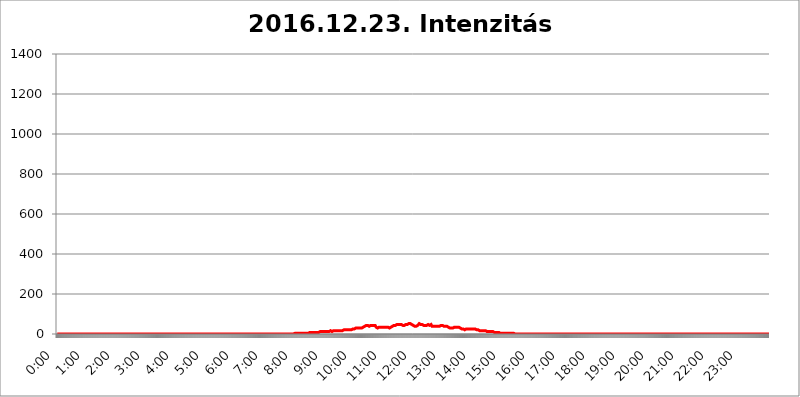
| Category | 2016.12.23. Intenzitás [W/m^2] |
|---|---|
| 0.0 | 0 |
| 0.0006944444444444445 | 0 |
| 0.001388888888888889 | 0 |
| 0.0020833333333333333 | 0 |
| 0.002777777777777778 | 0 |
| 0.003472222222222222 | 0 |
| 0.004166666666666667 | 0 |
| 0.004861111111111111 | 0 |
| 0.005555555555555556 | 0 |
| 0.0062499999999999995 | 0 |
| 0.006944444444444444 | 0 |
| 0.007638888888888889 | 0 |
| 0.008333333333333333 | 0 |
| 0.009027777777777779 | 0 |
| 0.009722222222222222 | 0 |
| 0.010416666666666666 | 0 |
| 0.011111111111111112 | 0 |
| 0.011805555555555555 | 0 |
| 0.012499999999999999 | 0 |
| 0.013194444444444444 | 0 |
| 0.013888888888888888 | 0 |
| 0.014583333333333332 | 0 |
| 0.015277777777777777 | 0 |
| 0.015972222222222224 | 0 |
| 0.016666666666666666 | 0 |
| 0.017361111111111112 | 0 |
| 0.018055555555555557 | 0 |
| 0.01875 | 0 |
| 0.019444444444444445 | 0 |
| 0.02013888888888889 | 0 |
| 0.020833333333333332 | 0 |
| 0.02152777777777778 | 0 |
| 0.022222222222222223 | 0 |
| 0.02291666666666667 | 0 |
| 0.02361111111111111 | 0 |
| 0.024305555555555556 | 0 |
| 0.024999999999999998 | 0 |
| 0.025694444444444447 | 0 |
| 0.02638888888888889 | 0 |
| 0.027083333333333334 | 0 |
| 0.027777777777777776 | 0 |
| 0.02847222222222222 | 0 |
| 0.029166666666666664 | 0 |
| 0.029861111111111113 | 0 |
| 0.030555555555555555 | 0 |
| 0.03125 | 0 |
| 0.03194444444444445 | 0 |
| 0.03263888888888889 | 0 |
| 0.03333333333333333 | 0 |
| 0.034027777777777775 | 0 |
| 0.034722222222222224 | 0 |
| 0.035416666666666666 | 0 |
| 0.036111111111111115 | 0 |
| 0.03680555555555556 | 0 |
| 0.0375 | 0 |
| 0.03819444444444444 | 0 |
| 0.03888888888888889 | 0 |
| 0.03958333333333333 | 0 |
| 0.04027777777777778 | 0 |
| 0.04097222222222222 | 0 |
| 0.041666666666666664 | 0 |
| 0.042361111111111106 | 0 |
| 0.04305555555555556 | 0 |
| 0.043750000000000004 | 0 |
| 0.044444444444444446 | 0 |
| 0.04513888888888889 | 0 |
| 0.04583333333333334 | 0 |
| 0.04652777777777778 | 0 |
| 0.04722222222222222 | 0 |
| 0.04791666666666666 | 0 |
| 0.04861111111111111 | 0 |
| 0.049305555555555554 | 0 |
| 0.049999999999999996 | 0 |
| 0.05069444444444445 | 0 |
| 0.051388888888888894 | 0 |
| 0.052083333333333336 | 0 |
| 0.05277777777777778 | 0 |
| 0.05347222222222222 | 0 |
| 0.05416666666666667 | 0 |
| 0.05486111111111111 | 0 |
| 0.05555555555555555 | 0 |
| 0.05625 | 0 |
| 0.05694444444444444 | 0 |
| 0.057638888888888885 | 0 |
| 0.05833333333333333 | 0 |
| 0.05902777777777778 | 0 |
| 0.059722222222222225 | 0 |
| 0.06041666666666667 | 0 |
| 0.061111111111111116 | 0 |
| 0.06180555555555556 | 0 |
| 0.0625 | 0 |
| 0.06319444444444444 | 0 |
| 0.06388888888888888 | 0 |
| 0.06458333333333334 | 0 |
| 0.06527777777777778 | 0 |
| 0.06597222222222222 | 0 |
| 0.06666666666666667 | 0 |
| 0.06736111111111111 | 0 |
| 0.06805555555555555 | 0 |
| 0.06874999999999999 | 0 |
| 0.06944444444444443 | 0 |
| 0.07013888888888889 | 0 |
| 0.07083333333333333 | 0 |
| 0.07152777777777779 | 0 |
| 0.07222222222222223 | 0 |
| 0.07291666666666667 | 0 |
| 0.07361111111111111 | 0 |
| 0.07430555555555556 | 0 |
| 0.075 | 0 |
| 0.07569444444444444 | 0 |
| 0.0763888888888889 | 0 |
| 0.07708333333333334 | 0 |
| 0.07777777777777778 | 0 |
| 0.07847222222222222 | 0 |
| 0.07916666666666666 | 0 |
| 0.0798611111111111 | 0 |
| 0.08055555555555556 | 0 |
| 0.08125 | 0 |
| 0.08194444444444444 | 0 |
| 0.08263888888888889 | 0 |
| 0.08333333333333333 | 0 |
| 0.08402777777777777 | 0 |
| 0.08472222222222221 | 0 |
| 0.08541666666666665 | 0 |
| 0.08611111111111112 | 0 |
| 0.08680555555555557 | 0 |
| 0.08750000000000001 | 0 |
| 0.08819444444444445 | 0 |
| 0.08888888888888889 | 0 |
| 0.08958333333333333 | 0 |
| 0.09027777777777778 | 0 |
| 0.09097222222222222 | 0 |
| 0.09166666666666667 | 0 |
| 0.09236111111111112 | 0 |
| 0.09305555555555556 | 0 |
| 0.09375 | 0 |
| 0.09444444444444444 | 0 |
| 0.09513888888888888 | 0 |
| 0.09583333333333333 | 0 |
| 0.09652777777777777 | 0 |
| 0.09722222222222222 | 0 |
| 0.09791666666666667 | 0 |
| 0.09861111111111111 | 0 |
| 0.09930555555555555 | 0 |
| 0.09999999999999999 | 0 |
| 0.10069444444444443 | 0 |
| 0.1013888888888889 | 0 |
| 0.10208333333333335 | 0 |
| 0.10277777777777779 | 0 |
| 0.10347222222222223 | 0 |
| 0.10416666666666667 | 0 |
| 0.10486111111111111 | 0 |
| 0.10555555555555556 | 0 |
| 0.10625 | 0 |
| 0.10694444444444444 | 0 |
| 0.1076388888888889 | 0 |
| 0.10833333333333334 | 0 |
| 0.10902777777777778 | 0 |
| 0.10972222222222222 | 0 |
| 0.1111111111111111 | 0 |
| 0.11180555555555556 | 0 |
| 0.11180555555555556 | 0 |
| 0.1125 | 0 |
| 0.11319444444444444 | 0 |
| 0.11388888888888889 | 0 |
| 0.11458333333333333 | 0 |
| 0.11527777777777777 | 0 |
| 0.11597222222222221 | 0 |
| 0.11666666666666665 | 0 |
| 0.1173611111111111 | 0 |
| 0.11805555555555557 | 0 |
| 0.11944444444444445 | 0 |
| 0.12013888888888889 | 0 |
| 0.12083333333333333 | 0 |
| 0.12152777777777778 | 0 |
| 0.12222222222222223 | 0 |
| 0.12291666666666667 | 0 |
| 0.12291666666666667 | 0 |
| 0.12361111111111112 | 0 |
| 0.12430555555555556 | 0 |
| 0.125 | 0 |
| 0.12569444444444444 | 0 |
| 0.12638888888888888 | 0 |
| 0.12708333333333333 | 0 |
| 0.16875 | 0 |
| 0.12847222222222224 | 0 |
| 0.12916666666666668 | 0 |
| 0.12986111111111112 | 0 |
| 0.13055555555555556 | 0 |
| 0.13125 | 0 |
| 0.13194444444444445 | 0 |
| 0.1326388888888889 | 0 |
| 0.13333333333333333 | 0 |
| 0.13402777777777777 | 0 |
| 0.13402777777777777 | 0 |
| 0.13472222222222222 | 0 |
| 0.13541666666666666 | 0 |
| 0.1361111111111111 | 0 |
| 0.13749999999999998 | 0 |
| 0.13819444444444443 | 0 |
| 0.1388888888888889 | 0 |
| 0.13958333333333334 | 0 |
| 0.14027777777777778 | 0 |
| 0.14097222222222222 | 0 |
| 0.14166666666666666 | 0 |
| 0.1423611111111111 | 0 |
| 0.14305555555555557 | 0 |
| 0.14375000000000002 | 0 |
| 0.14444444444444446 | 0 |
| 0.1451388888888889 | 0 |
| 0.1451388888888889 | 0 |
| 0.14652777777777778 | 0 |
| 0.14722222222222223 | 0 |
| 0.14791666666666667 | 0 |
| 0.1486111111111111 | 0 |
| 0.14930555555555555 | 0 |
| 0.15 | 0 |
| 0.15069444444444444 | 0 |
| 0.15138888888888888 | 0 |
| 0.15208333333333332 | 0 |
| 0.15277777777777776 | 0 |
| 0.15347222222222223 | 0 |
| 0.15416666666666667 | 0 |
| 0.15486111111111112 | 0 |
| 0.15555555555555556 | 0 |
| 0.15625 | 0 |
| 0.15694444444444444 | 0 |
| 0.15763888888888888 | 0 |
| 0.15833333333333333 | 0 |
| 0.15902777777777777 | 0 |
| 0.15972222222222224 | 0 |
| 0.16041666666666668 | 0 |
| 0.16111111111111112 | 0 |
| 0.16180555555555556 | 0 |
| 0.1625 | 0 |
| 0.16319444444444445 | 0 |
| 0.1638888888888889 | 0 |
| 0.16458333333333333 | 0 |
| 0.16527777777777777 | 0 |
| 0.16597222222222222 | 0 |
| 0.16666666666666666 | 0 |
| 0.1673611111111111 | 0 |
| 0.16805555555555554 | 0 |
| 0.16874999999999998 | 0 |
| 0.16944444444444443 | 0 |
| 0.17013888888888887 | 0 |
| 0.1708333333333333 | 0 |
| 0.17152777777777775 | 0 |
| 0.17222222222222225 | 0 |
| 0.1729166666666667 | 0 |
| 0.17361111111111113 | 0 |
| 0.17430555555555557 | 0 |
| 0.17500000000000002 | 0 |
| 0.17569444444444446 | 0 |
| 0.1763888888888889 | 0 |
| 0.17708333333333334 | 0 |
| 0.17777777777777778 | 0 |
| 0.17847222222222223 | 0 |
| 0.17916666666666667 | 0 |
| 0.1798611111111111 | 0 |
| 0.18055555555555555 | 0 |
| 0.18125 | 0 |
| 0.18194444444444444 | 0 |
| 0.1826388888888889 | 0 |
| 0.18333333333333335 | 0 |
| 0.1840277777777778 | 0 |
| 0.18472222222222223 | 0 |
| 0.18541666666666667 | 0 |
| 0.18611111111111112 | 0 |
| 0.18680555555555556 | 0 |
| 0.1875 | 0 |
| 0.18819444444444444 | 0 |
| 0.18888888888888888 | 0 |
| 0.18958333333333333 | 0 |
| 0.19027777777777777 | 0 |
| 0.1909722222222222 | 0 |
| 0.19166666666666665 | 0 |
| 0.19236111111111112 | 0 |
| 0.19305555555555554 | 0 |
| 0.19375 | 0 |
| 0.19444444444444445 | 0 |
| 0.1951388888888889 | 0 |
| 0.19583333333333333 | 0 |
| 0.19652777777777777 | 0 |
| 0.19722222222222222 | 0 |
| 0.19791666666666666 | 0 |
| 0.1986111111111111 | 0 |
| 0.19930555555555554 | 0 |
| 0.19999999999999998 | 0 |
| 0.20069444444444443 | 0 |
| 0.20138888888888887 | 0 |
| 0.2020833333333333 | 0 |
| 0.2027777777777778 | 0 |
| 0.2034722222222222 | 0 |
| 0.2041666666666667 | 0 |
| 0.20486111111111113 | 0 |
| 0.20555555555555557 | 0 |
| 0.20625000000000002 | 0 |
| 0.20694444444444446 | 0 |
| 0.2076388888888889 | 0 |
| 0.20833333333333334 | 0 |
| 0.20902777777777778 | 0 |
| 0.20972222222222223 | 0 |
| 0.21041666666666667 | 0 |
| 0.2111111111111111 | 0 |
| 0.21180555555555555 | 0 |
| 0.2125 | 0 |
| 0.21319444444444444 | 0 |
| 0.2138888888888889 | 0 |
| 0.21458333333333335 | 0 |
| 0.2152777777777778 | 0 |
| 0.21597222222222223 | 0 |
| 0.21666666666666667 | 0 |
| 0.21736111111111112 | 0 |
| 0.21805555555555556 | 0 |
| 0.21875 | 0 |
| 0.21944444444444444 | 0 |
| 0.22013888888888888 | 0 |
| 0.22083333333333333 | 0 |
| 0.22152777777777777 | 0 |
| 0.2222222222222222 | 0 |
| 0.22291666666666665 | 0 |
| 0.2236111111111111 | 0 |
| 0.22430555555555556 | 0 |
| 0.225 | 0 |
| 0.22569444444444445 | 0 |
| 0.2263888888888889 | 0 |
| 0.22708333333333333 | 0 |
| 0.22777777777777777 | 0 |
| 0.22847222222222222 | 0 |
| 0.22916666666666666 | 0 |
| 0.2298611111111111 | 0 |
| 0.23055555555555554 | 0 |
| 0.23124999999999998 | 0 |
| 0.23194444444444443 | 0 |
| 0.23263888888888887 | 0 |
| 0.2333333333333333 | 0 |
| 0.2340277777777778 | 0 |
| 0.2347222222222222 | 0 |
| 0.2354166666666667 | 0 |
| 0.23611111111111113 | 0 |
| 0.23680555555555557 | 0 |
| 0.23750000000000002 | 0 |
| 0.23819444444444446 | 0 |
| 0.2388888888888889 | 0 |
| 0.23958333333333334 | 0 |
| 0.24027777777777778 | 0 |
| 0.24097222222222223 | 0 |
| 0.24166666666666667 | 0 |
| 0.2423611111111111 | 0 |
| 0.24305555555555555 | 0 |
| 0.24375 | 0 |
| 0.24444444444444446 | 0 |
| 0.24513888888888888 | 0 |
| 0.24583333333333335 | 0 |
| 0.2465277777777778 | 0 |
| 0.24722222222222223 | 0 |
| 0.24791666666666667 | 0 |
| 0.24861111111111112 | 0 |
| 0.24930555555555556 | 0 |
| 0.25 | 0 |
| 0.25069444444444444 | 0 |
| 0.2513888888888889 | 0 |
| 0.2520833333333333 | 0 |
| 0.25277777777777777 | 0 |
| 0.2534722222222222 | 0 |
| 0.25416666666666665 | 0 |
| 0.2548611111111111 | 0 |
| 0.2555555555555556 | 0 |
| 0.25625000000000003 | 0 |
| 0.2569444444444445 | 0 |
| 0.2576388888888889 | 0 |
| 0.25833333333333336 | 0 |
| 0.2590277777777778 | 0 |
| 0.25972222222222224 | 0 |
| 0.2604166666666667 | 0 |
| 0.2611111111111111 | 0 |
| 0.26180555555555557 | 0 |
| 0.2625 | 0 |
| 0.26319444444444445 | 0 |
| 0.2638888888888889 | 0 |
| 0.26458333333333334 | 0 |
| 0.2652777777777778 | 0 |
| 0.2659722222222222 | 0 |
| 0.26666666666666666 | 0 |
| 0.2673611111111111 | 0 |
| 0.26805555555555555 | 0 |
| 0.26875 | 0 |
| 0.26944444444444443 | 0 |
| 0.2701388888888889 | 0 |
| 0.2708333333333333 | 0 |
| 0.27152777777777776 | 0 |
| 0.2722222222222222 | 0 |
| 0.27291666666666664 | 0 |
| 0.2736111111111111 | 0 |
| 0.2743055555555555 | 0 |
| 0.27499999999999997 | 0 |
| 0.27569444444444446 | 0 |
| 0.27638888888888885 | 0 |
| 0.27708333333333335 | 0 |
| 0.2777777777777778 | 0 |
| 0.27847222222222223 | 0 |
| 0.2791666666666667 | 0 |
| 0.2798611111111111 | 0 |
| 0.28055555555555556 | 0 |
| 0.28125 | 0 |
| 0.28194444444444444 | 0 |
| 0.2826388888888889 | 0 |
| 0.2833333333333333 | 0 |
| 0.28402777777777777 | 0 |
| 0.2847222222222222 | 0 |
| 0.28541666666666665 | 0 |
| 0.28611111111111115 | 0 |
| 0.28680555555555554 | 0 |
| 0.28750000000000003 | 0 |
| 0.2881944444444445 | 0 |
| 0.2888888888888889 | 0 |
| 0.28958333333333336 | 0 |
| 0.2902777777777778 | 0 |
| 0.29097222222222224 | 0 |
| 0.2916666666666667 | 0 |
| 0.2923611111111111 | 0 |
| 0.29305555555555557 | 0 |
| 0.29375 | 0 |
| 0.29444444444444445 | 0 |
| 0.2951388888888889 | 0 |
| 0.29583333333333334 | 0 |
| 0.2965277777777778 | 0 |
| 0.2972222222222222 | 0 |
| 0.29791666666666666 | 0 |
| 0.2986111111111111 | 0 |
| 0.29930555555555555 | 0 |
| 0.3 | 0 |
| 0.30069444444444443 | 0 |
| 0.3013888888888889 | 0 |
| 0.3020833333333333 | 0 |
| 0.30277777777777776 | 0 |
| 0.3034722222222222 | 0 |
| 0.30416666666666664 | 0 |
| 0.3048611111111111 | 0 |
| 0.3055555555555555 | 0 |
| 0.30624999999999997 | 0 |
| 0.3069444444444444 | 0 |
| 0.3076388888888889 | 0 |
| 0.30833333333333335 | 0 |
| 0.3090277777777778 | 0 |
| 0.30972222222222223 | 0 |
| 0.3104166666666667 | 0 |
| 0.3111111111111111 | 0 |
| 0.31180555555555556 | 0 |
| 0.3125 | 0 |
| 0.31319444444444444 | 0 |
| 0.3138888888888889 | 0 |
| 0.3145833333333333 | 0 |
| 0.31527777777777777 | 0 |
| 0.3159722222222222 | 0 |
| 0.31666666666666665 | 0 |
| 0.31736111111111115 | 0 |
| 0.31805555555555554 | 0 |
| 0.31875000000000003 | 0 |
| 0.3194444444444445 | 0 |
| 0.3201388888888889 | 0 |
| 0.32083333333333336 | 0 |
| 0.3215277777777778 | 0 |
| 0.32222222222222224 | 0 |
| 0.3229166666666667 | 0 |
| 0.3236111111111111 | 0 |
| 0.32430555555555557 | 0 |
| 0.325 | 0 |
| 0.32569444444444445 | 0 |
| 0.3263888888888889 | 0 |
| 0.32708333333333334 | 0 |
| 0.3277777777777778 | 0 |
| 0.3284722222222222 | 0 |
| 0.32916666666666666 | 0 |
| 0.3298611111111111 | 0 |
| 0.33055555555555555 | 0 |
| 0.33125 | 0 |
| 0.33194444444444443 | 0 |
| 0.3326388888888889 | 3.525 |
| 0.3333333333333333 | 3.525 |
| 0.3340277777777778 | 3.525 |
| 0.3347222222222222 | 3.525 |
| 0.3354166666666667 | 3.525 |
| 0.3361111111111111 | 3.525 |
| 0.3368055555555556 | 3.525 |
| 0.33749999999999997 | 3.525 |
| 0.33819444444444446 | 3.525 |
| 0.33888888888888885 | 3.525 |
| 0.33958333333333335 | 3.525 |
| 0.34027777777777773 | 3.525 |
| 0.34097222222222223 | 3.525 |
| 0.3416666666666666 | 3.525 |
| 0.3423611111111111 | 3.525 |
| 0.3430555555555555 | 3.525 |
| 0.34375 | 3.525 |
| 0.3444444444444445 | 3.525 |
| 0.3451388888888889 | 3.525 |
| 0.3458333333333334 | 3.525 |
| 0.34652777777777777 | 3.525 |
| 0.34722222222222227 | 3.525 |
| 0.34791666666666665 | 3.525 |
| 0.34861111111111115 | 3.525 |
| 0.34930555555555554 | 3.525 |
| 0.35000000000000003 | 3.525 |
| 0.3506944444444444 | 3.525 |
| 0.3513888888888889 | 3.525 |
| 0.3520833333333333 | 3.525 |
| 0.3527777777777778 | 7.887 |
| 0.3534722222222222 | 7.887 |
| 0.3541666666666667 | 7.887 |
| 0.3548611111111111 | 7.887 |
| 0.35555555555555557 | 7.887 |
| 0.35625 | 7.887 |
| 0.35694444444444445 | 7.887 |
| 0.3576388888888889 | 7.887 |
| 0.35833333333333334 | 7.887 |
| 0.3590277777777778 | 7.887 |
| 0.3597222222222222 | 7.887 |
| 0.36041666666666666 | 7.887 |
| 0.3611111111111111 | 7.887 |
| 0.36180555555555555 | 7.887 |
| 0.3625 | 7.887 |
| 0.36319444444444443 | 7.887 |
| 0.3638888888888889 | 7.887 |
| 0.3645833333333333 | 7.887 |
| 0.3652777777777778 | 7.887 |
| 0.3659722222222222 | 7.887 |
| 0.3666666666666667 | 7.887 |
| 0.3673611111111111 | 12.257 |
| 0.3680555555555556 | 12.257 |
| 0.36874999999999997 | 12.257 |
| 0.36944444444444446 | 12.257 |
| 0.37013888888888885 | 12.257 |
| 0.37083333333333335 | 12.257 |
| 0.37152777777777773 | 12.257 |
| 0.37222222222222223 | 12.257 |
| 0.3729166666666666 | 12.257 |
| 0.3736111111111111 | 12.257 |
| 0.3743055555555555 | 12.257 |
| 0.375 | 12.257 |
| 0.3756944444444445 | 12.257 |
| 0.3763888888888889 | 12.257 |
| 0.3770833333333334 | 12.257 |
| 0.37777777777777777 | 12.257 |
| 0.37847222222222227 | 12.257 |
| 0.37916666666666665 | 12.257 |
| 0.37986111111111115 | 12.257 |
| 0.38055555555555554 | 12.257 |
| 0.38125000000000003 | 12.257 |
| 0.3819444444444444 | 12.257 |
| 0.3826388888888889 | 12.257 |
| 0.3833333333333333 | 16.636 |
| 0.3840277777777778 | 16.636 |
| 0.3847222222222222 | 16.636 |
| 0.3854166666666667 | 12.257 |
| 0.3861111111111111 | 16.636 |
| 0.38680555555555557 | 16.636 |
| 0.3875 | 16.636 |
| 0.38819444444444445 | 16.636 |
| 0.3888888888888889 | 16.636 |
| 0.38958333333333334 | 16.636 |
| 0.3902777777777778 | 16.636 |
| 0.3909722222222222 | 16.636 |
| 0.39166666666666666 | 16.636 |
| 0.3923611111111111 | 16.636 |
| 0.39305555555555555 | 16.636 |
| 0.39375 | 16.636 |
| 0.39444444444444443 | 16.636 |
| 0.3951388888888889 | 16.636 |
| 0.3958333333333333 | 16.636 |
| 0.3965277777777778 | 16.636 |
| 0.3972222222222222 | 16.636 |
| 0.3979166666666667 | 16.636 |
| 0.3986111111111111 | 16.636 |
| 0.3993055555555556 | 16.636 |
| 0.39999999999999997 | 16.636 |
| 0.40069444444444446 | 21.024 |
| 0.40138888888888885 | 21.024 |
| 0.40208333333333335 | 21.024 |
| 0.40277777777777773 | 21.024 |
| 0.40347222222222223 | 21.024 |
| 0.4041666666666666 | 21.024 |
| 0.4048611111111111 | 21.024 |
| 0.4055555555555555 | 21.024 |
| 0.40625 | 21.024 |
| 0.4069444444444445 | 21.024 |
| 0.4076388888888889 | 21.024 |
| 0.4083333333333334 | 21.024 |
| 0.40902777777777777 | 21.024 |
| 0.40972222222222227 | 21.024 |
| 0.41041666666666665 | 21.024 |
| 0.41111111111111115 | 21.024 |
| 0.41180555555555554 | 21.024 |
| 0.41250000000000003 | 21.024 |
| 0.4131944444444444 | 21.024 |
| 0.4138888888888889 | 21.024 |
| 0.4145833333333333 | 25.419 |
| 0.4152777777777778 | 25.419 |
| 0.4159722222222222 | 25.419 |
| 0.4166666666666667 | 25.419 |
| 0.4173611111111111 | 29.823 |
| 0.41805555555555557 | 29.823 |
| 0.41875 | 29.823 |
| 0.41944444444444445 | 29.823 |
| 0.4201388888888889 | 29.823 |
| 0.42083333333333334 | 29.823 |
| 0.4215277777777778 | 29.823 |
| 0.4222222222222222 | 29.823 |
| 0.42291666666666666 | 29.823 |
| 0.4236111111111111 | 29.823 |
| 0.42430555555555555 | 29.823 |
| 0.425 | 29.823 |
| 0.42569444444444443 | 29.823 |
| 0.4263888888888889 | 29.823 |
| 0.4270833333333333 | 29.823 |
| 0.4277777777777778 | 29.823 |
| 0.4284722222222222 | 29.823 |
| 0.4291666666666667 | 34.234 |
| 0.4298611111111111 | 34.234 |
| 0.4305555555555556 | 38.653 |
| 0.43124999999999997 | 38.653 |
| 0.43194444444444446 | 43.079 |
| 0.43263888888888885 | 43.079 |
| 0.43333333333333335 | 43.079 |
| 0.43402777777777773 | 43.079 |
| 0.43472222222222223 | 43.079 |
| 0.4354166666666666 | 43.079 |
| 0.4361111111111111 | 43.079 |
| 0.4368055555555555 | 38.653 |
| 0.4375 | 38.653 |
| 0.4381944444444445 | 38.653 |
| 0.4388888888888889 | 38.653 |
| 0.4395833333333334 | 43.079 |
| 0.44027777777777777 | 38.653 |
| 0.44097222222222227 | 38.653 |
| 0.44166666666666665 | 43.079 |
| 0.44236111111111115 | 43.079 |
| 0.44305555555555554 | 43.079 |
| 0.44375000000000003 | 43.079 |
| 0.4444444444444444 | 43.079 |
| 0.4451388888888889 | 43.079 |
| 0.4458333333333333 | 43.079 |
| 0.4465277777777778 | 38.653 |
| 0.4472222222222222 | 34.234 |
| 0.4479166666666667 | 34.234 |
| 0.4486111111111111 | 34.234 |
| 0.44930555555555557 | 29.823 |
| 0.45 | 34.234 |
| 0.45069444444444445 | 34.234 |
| 0.4513888888888889 | 34.234 |
| 0.45208333333333334 | 34.234 |
| 0.4527777777777778 | 34.234 |
| 0.4534722222222222 | 34.234 |
| 0.45416666666666666 | 34.234 |
| 0.4548611111111111 | 34.234 |
| 0.45555555555555555 | 34.234 |
| 0.45625 | 34.234 |
| 0.45694444444444443 | 34.234 |
| 0.4576388888888889 | 34.234 |
| 0.4583333333333333 | 34.234 |
| 0.4590277777777778 | 34.234 |
| 0.4597222222222222 | 34.234 |
| 0.4604166666666667 | 34.234 |
| 0.4611111111111111 | 34.234 |
| 0.4618055555555556 | 34.234 |
| 0.46249999999999997 | 34.234 |
| 0.46319444444444446 | 34.234 |
| 0.46388888888888885 | 34.234 |
| 0.46458333333333335 | 34.234 |
| 0.46527777777777773 | 29.823 |
| 0.46597222222222223 | 29.823 |
| 0.4666666666666666 | 29.823 |
| 0.4673611111111111 | 34.234 |
| 0.4680555555555555 | 34.234 |
| 0.46875 | 34.234 |
| 0.4694444444444445 | 38.653 |
| 0.4701388888888889 | 38.653 |
| 0.4708333333333334 | 38.653 |
| 0.47152777777777777 | 43.079 |
| 0.47222222222222227 | 43.079 |
| 0.47291666666666665 | 43.079 |
| 0.47361111111111115 | 47.511 |
| 0.47430555555555554 | 43.079 |
| 0.47500000000000003 | 43.079 |
| 0.4756944444444444 | 47.511 |
| 0.4763888888888889 | 47.511 |
| 0.4770833333333333 | 47.511 |
| 0.4777777777777778 | 47.511 |
| 0.4784722222222222 | 47.511 |
| 0.4791666666666667 | 47.511 |
| 0.4798611111111111 | 47.511 |
| 0.48055555555555557 | 47.511 |
| 0.48125 | 47.511 |
| 0.48194444444444445 | 47.511 |
| 0.4826388888888889 | 47.511 |
| 0.48333333333333334 | 47.511 |
| 0.4840277777777778 | 47.511 |
| 0.4847222222222222 | 43.079 |
| 0.48541666666666666 | 43.079 |
| 0.4861111111111111 | 43.079 |
| 0.48680555555555555 | 43.079 |
| 0.4875 | 43.079 |
| 0.48819444444444443 | 43.079 |
| 0.4888888888888889 | 47.511 |
| 0.4895833333333333 | 47.511 |
| 0.4902777777777778 | 43.079 |
| 0.4909722222222222 | 47.511 |
| 0.4916666666666667 | 47.511 |
| 0.4923611111111111 | 47.511 |
| 0.4930555555555556 | 51.951 |
| 0.49374999999999997 | 51.951 |
| 0.49444444444444446 | 56.398 |
| 0.49513888888888885 | 51.951 |
| 0.49583333333333335 | 51.951 |
| 0.49652777777777773 | 47.511 |
| 0.49722222222222223 | 47.511 |
| 0.4979166666666666 | 47.511 |
| 0.4986111111111111 | 43.079 |
| 0.4993055555555555 | 43.079 |
| 0.5 | 43.079 |
| 0.5006944444444444 | 38.653 |
| 0.5013888888888889 | 38.653 |
| 0.5020833333333333 | 38.653 |
| 0.5027777777777778 | 38.653 |
| 0.5034722222222222 | 38.653 |
| 0.5041666666666667 | 43.079 |
| 0.5048611111111111 | 43.079 |
| 0.5055555555555555 | 43.079 |
| 0.50625 | 47.511 |
| 0.5069444444444444 | 47.511 |
| 0.5076388888888889 | 51.951 |
| 0.5083333333333333 | 51.951 |
| 0.5090277777777777 | 47.511 |
| 0.5097222222222222 | 47.511 |
| 0.5104166666666666 | 47.511 |
| 0.5111111111111112 | 47.511 |
| 0.5118055555555555 | 47.511 |
| 0.5125000000000001 | 43.079 |
| 0.5131944444444444 | 43.079 |
| 0.513888888888889 | 43.079 |
| 0.5145833333333333 | 47.511 |
| 0.5152777777777778 | 47.511 |
| 0.5159722222222222 | 43.079 |
| 0.5166666666666667 | 43.079 |
| 0.517361111111111 | 43.079 |
| 0.5180555555555556 | 43.079 |
| 0.5187499999999999 | 47.511 |
| 0.5194444444444445 | 47.511 |
| 0.5201388888888888 | 47.511 |
| 0.5208333333333334 | 47.511 |
| 0.5215277777777778 | 43.079 |
| 0.5222222222222223 | 43.079 |
| 0.5229166666666667 | 43.079 |
| 0.5236111111111111 | 47.511 |
| 0.5243055555555556 | 47.511 |
| 0.525 | 43.079 |
| 0.5256944444444445 | 38.653 |
| 0.5263888888888889 | 38.653 |
| 0.5270833333333333 | 38.653 |
| 0.5277777777777778 | 38.653 |
| 0.5284722222222222 | 43.079 |
| 0.5291666666666667 | 43.079 |
| 0.5298611111111111 | 38.653 |
| 0.5305555555555556 | 38.653 |
| 0.53125 | 38.653 |
| 0.5319444444444444 | 38.653 |
| 0.5326388888888889 | 38.653 |
| 0.5333333333333333 | 38.653 |
| 0.5340277777777778 | 38.653 |
| 0.5347222222222222 | 38.653 |
| 0.5354166666666667 | 38.653 |
| 0.5361111111111111 | 38.653 |
| 0.5368055555555555 | 38.653 |
| 0.5375 | 38.653 |
| 0.5381944444444444 | 43.079 |
| 0.5388888888888889 | 43.079 |
| 0.5395833333333333 | 43.079 |
| 0.5402777777777777 | 43.079 |
| 0.5409722222222222 | 43.079 |
| 0.5416666666666666 | 38.653 |
| 0.5423611111111112 | 38.653 |
| 0.5430555555555555 | 38.653 |
| 0.5437500000000001 | 38.653 |
| 0.5444444444444444 | 38.653 |
| 0.545138888888889 | 43.079 |
| 0.5458333333333333 | 38.653 |
| 0.5465277777777778 | 38.653 |
| 0.5472222222222222 | 38.653 |
| 0.5479166666666667 | 34.234 |
| 0.548611111111111 | 34.234 |
| 0.5493055555555556 | 29.823 |
| 0.5499999999999999 | 29.823 |
| 0.5506944444444445 | 29.823 |
| 0.5513888888888888 | 29.823 |
| 0.5520833333333334 | 29.823 |
| 0.5527777777777778 | 29.823 |
| 0.5534722222222223 | 29.823 |
| 0.5541666666666667 | 29.823 |
| 0.5548611111111111 | 29.823 |
| 0.5555555555555556 | 29.823 |
| 0.55625 | 29.823 |
| 0.5569444444444445 | 34.234 |
| 0.5576388888888889 | 34.234 |
| 0.5583333333333333 | 34.234 |
| 0.5590277777777778 | 34.234 |
| 0.5597222222222222 | 34.234 |
| 0.5604166666666667 | 38.653 |
| 0.5611111111111111 | 34.234 |
| 0.5618055555555556 | 34.234 |
| 0.5625 | 34.234 |
| 0.5631944444444444 | 34.234 |
| 0.5638888888888889 | 29.823 |
| 0.5645833333333333 | 29.823 |
| 0.5652777777777778 | 29.823 |
| 0.5659722222222222 | 29.823 |
| 0.5666666666666667 | 29.823 |
| 0.5673611111111111 | 25.419 |
| 0.5680555555555555 | 29.823 |
| 0.56875 | 25.419 |
| 0.5694444444444444 | 25.419 |
| 0.5701388888888889 | 25.419 |
| 0.5708333333333333 | 21.024 |
| 0.5715277777777777 | 21.024 |
| 0.5722222222222222 | 21.024 |
| 0.5729166666666666 | 21.024 |
| 0.5736111111111112 | 25.419 |
| 0.5743055555555555 | 25.419 |
| 0.5750000000000001 | 25.419 |
| 0.5756944444444444 | 25.419 |
| 0.576388888888889 | 25.419 |
| 0.5770833333333333 | 25.419 |
| 0.5777777777777778 | 25.419 |
| 0.5784722222222222 | 25.419 |
| 0.5791666666666667 | 25.419 |
| 0.579861111111111 | 25.419 |
| 0.5805555555555556 | 29.823 |
| 0.5812499999999999 | 25.419 |
| 0.5819444444444445 | 25.419 |
| 0.5826388888888888 | 29.823 |
| 0.5833333333333334 | 25.419 |
| 0.5840277777777778 | 25.419 |
| 0.5847222222222223 | 25.419 |
| 0.5854166666666667 | 25.419 |
| 0.5861111111111111 | 25.419 |
| 0.5868055555555556 | 25.419 |
| 0.5875 | 25.419 |
| 0.5881944444444445 | 21.024 |
| 0.5888888888888889 | 21.024 |
| 0.5895833333333333 | 21.024 |
| 0.5902777777777778 | 21.024 |
| 0.5909722222222222 | 21.024 |
| 0.5916666666666667 | 16.636 |
| 0.5923611111111111 | 16.636 |
| 0.5930555555555556 | 16.636 |
| 0.59375 | 16.636 |
| 0.5944444444444444 | 16.636 |
| 0.5951388888888889 | 16.636 |
| 0.5958333333333333 | 16.636 |
| 0.5965277777777778 | 16.636 |
| 0.5972222222222222 | 16.636 |
| 0.5979166666666667 | 16.636 |
| 0.5986111111111111 | 16.636 |
| 0.5993055555555555 | 16.636 |
| 0.6 | 16.636 |
| 0.6006944444444444 | 16.636 |
| 0.6013888888888889 | 16.636 |
| 0.6020833333333333 | 16.636 |
| 0.6027777777777777 | 12.257 |
| 0.6034722222222222 | 12.257 |
| 0.6041666666666666 | 12.257 |
| 0.6048611111111112 | 12.257 |
| 0.6055555555555555 | 12.257 |
| 0.6062500000000001 | 12.257 |
| 0.6069444444444444 | 12.257 |
| 0.607638888888889 | 12.257 |
| 0.6083333333333333 | 12.257 |
| 0.6090277777777778 | 12.257 |
| 0.6097222222222222 | 12.257 |
| 0.6104166666666667 | 12.257 |
| 0.611111111111111 | 12.257 |
| 0.6118055555555556 | 12.257 |
| 0.6124999999999999 | 7.887 |
| 0.6131944444444445 | 7.887 |
| 0.6138888888888888 | 7.887 |
| 0.6145833333333334 | 7.887 |
| 0.6152777777777778 | 7.887 |
| 0.6159722222222223 | 7.887 |
| 0.6166666666666667 | 7.887 |
| 0.6173611111111111 | 7.887 |
| 0.6180555555555556 | 7.887 |
| 0.61875 | 7.887 |
| 0.6194444444444445 | 7.887 |
| 0.6201388888888889 | 7.887 |
| 0.6208333333333333 | 7.887 |
| 0.6215277777777778 | 3.525 |
| 0.6222222222222222 | 7.887 |
| 0.6229166666666667 | 3.525 |
| 0.6236111111111111 | 3.525 |
| 0.6243055555555556 | 3.525 |
| 0.625 | 3.525 |
| 0.6256944444444444 | 3.525 |
| 0.6263888888888889 | 3.525 |
| 0.6270833333333333 | 3.525 |
| 0.6277777777777778 | 3.525 |
| 0.6284722222222222 | 3.525 |
| 0.6291666666666667 | 3.525 |
| 0.6298611111111111 | 3.525 |
| 0.6305555555555555 | 3.525 |
| 0.63125 | 3.525 |
| 0.6319444444444444 | 3.525 |
| 0.6326388888888889 | 3.525 |
| 0.6333333333333333 | 3.525 |
| 0.6340277777777777 | 3.525 |
| 0.6347222222222222 | 3.525 |
| 0.6354166666666666 | 3.525 |
| 0.6361111111111112 | 3.525 |
| 0.6368055555555555 | 3.525 |
| 0.6375000000000001 | 3.525 |
| 0.6381944444444444 | 3.525 |
| 0.638888888888889 | 3.525 |
| 0.6395833333333333 | 0 |
| 0.6402777777777778 | 3.525 |
| 0.6409722222222222 | 3.525 |
| 0.6416666666666667 | 0 |
| 0.642361111111111 | 0 |
| 0.6430555555555556 | 0 |
| 0.6437499999999999 | 0 |
| 0.6444444444444445 | 0 |
| 0.6451388888888888 | 0 |
| 0.6458333333333334 | 0 |
| 0.6465277777777778 | 0 |
| 0.6472222222222223 | 0 |
| 0.6479166666666667 | 0 |
| 0.6486111111111111 | 0 |
| 0.6493055555555556 | 0 |
| 0.65 | 0 |
| 0.6506944444444445 | 0 |
| 0.6513888888888889 | 0 |
| 0.6520833333333333 | 0 |
| 0.6527777777777778 | 0 |
| 0.6534722222222222 | 0 |
| 0.6541666666666667 | 0 |
| 0.6548611111111111 | 0 |
| 0.6555555555555556 | 0 |
| 0.65625 | 0 |
| 0.6569444444444444 | 0 |
| 0.6576388888888889 | 0 |
| 0.6583333333333333 | 0 |
| 0.6590277777777778 | 0 |
| 0.6597222222222222 | 0 |
| 0.6604166666666667 | 0 |
| 0.6611111111111111 | 0 |
| 0.6618055555555555 | 0 |
| 0.6625 | 0 |
| 0.6631944444444444 | 0 |
| 0.6638888888888889 | 0 |
| 0.6645833333333333 | 0 |
| 0.6652777777777777 | 0 |
| 0.6659722222222222 | 0 |
| 0.6666666666666666 | 0 |
| 0.6673611111111111 | 0 |
| 0.6680555555555556 | 0 |
| 0.6687500000000001 | 0 |
| 0.6694444444444444 | 0 |
| 0.6701388888888888 | 0 |
| 0.6708333333333334 | 0 |
| 0.6715277777777778 | 0 |
| 0.6722222222222222 | 0 |
| 0.6729166666666666 | 0 |
| 0.6736111111111112 | 0 |
| 0.6743055555555556 | 0 |
| 0.6749999999999999 | 0 |
| 0.6756944444444444 | 0 |
| 0.6763888888888889 | 0 |
| 0.6770833333333334 | 0 |
| 0.6777777777777777 | 0 |
| 0.6784722222222223 | 0 |
| 0.6791666666666667 | 0 |
| 0.6798611111111111 | 0 |
| 0.6805555555555555 | 0 |
| 0.68125 | 0 |
| 0.6819444444444445 | 0 |
| 0.6826388888888889 | 0 |
| 0.6833333333333332 | 0 |
| 0.6840277777777778 | 0 |
| 0.6847222222222222 | 0 |
| 0.6854166666666667 | 0 |
| 0.686111111111111 | 0 |
| 0.6868055555555556 | 0 |
| 0.6875 | 0 |
| 0.6881944444444444 | 0 |
| 0.688888888888889 | 0 |
| 0.6895833333333333 | 0 |
| 0.6902777777777778 | 0 |
| 0.6909722222222222 | 0 |
| 0.6916666666666668 | 0 |
| 0.6923611111111111 | 0 |
| 0.6930555555555555 | 0 |
| 0.69375 | 0 |
| 0.6944444444444445 | 0 |
| 0.6951388888888889 | 0 |
| 0.6958333333333333 | 0 |
| 0.6965277777777777 | 0 |
| 0.6972222222222223 | 0 |
| 0.6979166666666666 | 0 |
| 0.6986111111111111 | 0 |
| 0.6993055555555556 | 0 |
| 0.7000000000000001 | 0 |
| 0.7006944444444444 | 0 |
| 0.7013888888888888 | 0 |
| 0.7020833333333334 | 0 |
| 0.7027777777777778 | 0 |
| 0.7034722222222222 | 0 |
| 0.7041666666666666 | 0 |
| 0.7048611111111112 | 0 |
| 0.7055555555555556 | 0 |
| 0.7062499999999999 | 0 |
| 0.7069444444444444 | 0 |
| 0.7076388888888889 | 0 |
| 0.7083333333333334 | 0 |
| 0.7090277777777777 | 0 |
| 0.7097222222222223 | 0 |
| 0.7104166666666667 | 0 |
| 0.7111111111111111 | 0 |
| 0.7118055555555555 | 0 |
| 0.7125 | 0 |
| 0.7131944444444445 | 0 |
| 0.7138888888888889 | 0 |
| 0.7145833333333332 | 0 |
| 0.7152777777777778 | 0 |
| 0.7159722222222222 | 0 |
| 0.7166666666666667 | 0 |
| 0.717361111111111 | 0 |
| 0.7180555555555556 | 0 |
| 0.71875 | 0 |
| 0.7194444444444444 | 0 |
| 0.720138888888889 | 0 |
| 0.7208333333333333 | 0 |
| 0.7215277777777778 | 0 |
| 0.7222222222222222 | 0 |
| 0.7229166666666668 | 0 |
| 0.7236111111111111 | 0 |
| 0.7243055555555555 | 0 |
| 0.725 | 0 |
| 0.7256944444444445 | 0 |
| 0.7263888888888889 | 0 |
| 0.7270833333333333 | 0 |
| 0.7277777777777777 | 0 |
| 0.7284722222222223 | 0 |
| 0.7291666666666666 | 0 |
| 0.7298611111111111 | 0 |
| 0.7305555555555556 | 0 |
| 0.7312500000000001 | 0 |
| 0.7319444444444444 | 0 |
| 0.7326388888888888 | 0 |
| 0.7333333333333334 | 0 |
| 0.7340277777777778 | 0 |
| 0.7347222222222222 | 0 |
| 0.7354166666666666 | 0 |
| 0.7361111111111112 | 0 |
| 0.7368055555555556 | 0 |
| 0.7374999999999999 | 0 |
| 0.7381944444444444 | 0 |
| 0.7388888888888889 | 0 |
| 0.7395833333333334 | 0 |
| 0.7402777777777777 | 0 |
| 0.7409722222222223 | 0 |
| 0.7416666666666667 | 0 |
| 0.7423611111111111 | 0 |
| 0.7430555555555555 | 0 |
| 0.74375 | 0 |
| 0.7444444444444445 | 0 |
| 0.7451388888888889 | 0 |
| 0.7458333333333332 | 0 |
| 0.7465277777777778 | 0 |
| 0.7472222222222222 | 0 |
| 0.7479166666666667 | 0 |
| 0.748611111111111 | 0 |
| 0.7493055555555556 | 0 |
| 0.75 | 0 |
| 0.7506944444444444 | 0 |
| 0.751388888888889 | 0 |
| 0.7520833333333333 | 0 |
| 0.7527777777777778 | 0 |
| 0.7534722222222222 | 0 |
| 0.7541666666666668 | 0 |
| 0.7548611111111111 | 0 |
| 0.7555555555555555 | 0 |
| 0.75625 | 0 |
| 0.7569444444444445 | 0 |
| 0.7576388888888889 | 0 |
| 0.7583333333333333 | 0 |
| 0.7590277777777777 | 0 |
| 0.7597222222222223 | 0 |
| 0.7604166666666666 | 0 |
| 0.7611111111111111 | 0 |
| 0.7618055555555556 | 0 |
| 0.7625000000000001 | 0 |
| 0.7631944444444444 | 0 |
| 0.7638888888888888 | 0 |
| 0.7645833333333334 | 0 |
| 0.7652777777777778 | 0 |
| 0.7659722222222222 | 0 |
| 0.7666666666666666 | 0 |
| 0.7673611111111112 | 0 |
| 0.7680555555555556 | 0 |
| 0.7687499999999999 | 0 |
| 0.7694444444444444 | 0 |
| 0.7701388888888889 | 0 |
| 0.7708333333333334 | 0 |
| 0.7715277777777777 | 0 |
| 0.7722222222222223 | 0 |
| 0.7729166666666667 | 0 |
| 0.7736111111111111 | 0 |
| 0.7743055555555555 | 0 |
| 0.775 | 0 |
| 0.7756944444444445 | 0 |
| 0.7763888888888889 | 0 |
| 0.7770833333333332 | 0 |
| 0.7777777777777778 | 0 |
| 0.7784722222222222 | 0 |
| 0.7791666666666667 | 0 |
| 0.779861111111111 | 0 |
| 0.7805555555555556 | 0 |
| 0.78125 | 0 |
| 0.7819444444444444 | 0 |
| 0.782638888888889 | 0 |
| 0.7833333333333333 | 0 |
| 0.7840277777777778 | 0 |
| 0.7847222222222222 | 0 |
| 0.7854166666666668 | 0 |
| 0.7861111111111111 | 0 |
| 0.7868055555555555 | 0 |
| 0.7875 | 0 |
| 0.7881944444444445 | 0 |
| 0.7888888888888889 | 0 |
| 0.7895833333333333 | 0 |
| 0.7902777777777777 | 0 |
| 0.7909722222222223 | 0 |
| 0.7916666666666666 | 0 |
| 0.7923611111111111 | 0 |
| 0.7930555555555556 | 0 |
| 0.7937500000000001 | 0 |
| 0.7944444444444444 | 0 |
| 0.7951388888888888 | 0 |
| 0.7958333333333334 | 0 |
| 0.7965277777777778 | 0 |
| 0.7972222222222222 | 0 |
| 0.7979166666666666 | 0 |
| 0.7986111111111112 | 0 |
| 0.7993055555555556 | 0 |
| 0.7999999999999999 | 0 |
| 0.8006944444444444 | 0 |
| 0.8013888888888889 | 0 |
| 0.8020833333333334 | 0 |
| 0.8027777777777777 | 0 |
| 0.8034722222222223 | 0 |
| 0.8041666666666667 | 0 |
| 0.8048611111111111 | 0 |
| 0.8055555555555555 | 0 |
| 0.80625 | 0 |
| 0.8069444444444445 | 0 |
| 0.8076388888888889 | 0 |
| 0.8083333333333332 | 0 |
| 0.8090277777777778 | 0 |
| 0.8097222222222222 | 0 |
| 0.8104166666666667 | 0 |
| 0.811111111111111 | 0 |
| 0.8118055555555556 | 0 |
| 0.8125 | 0 |
| 0.8131944444444444 | 0 |
| 0.813888888888889 | 0 |
| 0.8145833333333333 | 0 |
| 0.8152777777777778 | 0 |
| 0.8159722222222222 | 0 |
| 0.8166666666666668 | 0 |
| 0.8173611111111111 | 0 |
| 0.8180555555555555 | 0 |
| 0.81875 | 0 |
| 0.8194444444444445 | 0 |
| 0.8201388888888889 | 0 |
| 0.8208333333333333 | 0 |
| 0.8215277777777777 | 0 |
| 0.8222222222222223 | 0 |
| 0.8229166666666666 | 0 |
| 0.8236111111111111 | 0 |
| 0.8243055555555556 | 0 |
| 0.8250000000000001 | 0 |
| 0.8256944444444444 | 0 |
| 0.8263888888888888 | 0 |
| 0.8270833333333334 | 0 |
| 0.8277777777777778 | 0 |
| 0.8284722222222222 | 0 |
| 0.8291666666666666 | 0 |
| 0.8298611111111112 | 0 |
| 0.8305555555555556 | 0 |
| 0.8312499999999999 | 0 |
| 0.8319444444444444 | 0 |
| 0.8326388888888889 | 0 |
| 0.8333333333333334 | 0 |
| 0.8340277777777777 | 0 |
| 0.8347222222222223 | 0 |
| 0.8354166666666667 | 0 |
| 0.8361111111111111 | 0 |
| 0.8368055555555555 | 0 |
| 0.8375 | 0 |
| 0.8381944444444445 | 0 |
| 0.8388888888888889 | 0 |
| 0.8395833333333332 | 0 |
| 0.8402777777777778 | 0 |
| 0.8409722222222222 | 0 |
| 0.8416666666666667 | 0 |
| 0.842361111111111 | 0 |
| 0.8430555555555556 | 0 |
| 0.84375 | 0 |
| 0.8444444444444444 | 0 |
| 0.845138888888889 | 0 |
| 0.8458333333333333 | 0 |
| 0.8465277777777778 | 0 |
| 0.8472222222222222 | 0 |
| 0.8479166666666668 | 0 |
| 0.8486111111111111 | 0 |
| 0.8493055555555555 | 0 |
| 0.85 | 0 |
| 0.8506944444444445 | 0 |
| 0.8513888888888889 | 0 |
| 0.8520833333333333 | 0 |
| 0.8527777777777777 | 0 |
| 0.8534722222222223 | 0 |
| 0.8541666666666666 | 0 |
| 0.8548611111111111 | 0 |
| 0.8555555555555556 | 0 |
| 0.8562500000000001 | 0 |
| 0.8569444444444444 | 0 |
| 0.8576388888888888 | 0 |
| 0.8583333333333334 | 0 |
| 0.8590277777777778 | 0 |
| 0.8597222222222222 | 0 |
| 0.8604166666666666 | 0 |
| 0.8611111111111112 | 0 |
| 0.8618055555555556 | 0 |
| 0.8624999999999999 | 0 |
| 0.8631944444444444 | 0 |
| 0.8638888888888889 | 0 |
| 0.8645833333333334 | 0 |
| 0.8652777777777777 | 0 |
| 0.8659722222222223 | 0 |
| 0.8666666666666667 | 0 |
| 0.8673611111111111 | 0 |
| 0.8680555555555555 | 0 |
| 0.86875 | 0 |
| 0.8694444444444445 | 0 |
| 0.8701388888888889 | 0 |
| 0.8708333333333332 | 0 |
| 0.8715277777777778 | 0 |
| 0.8722222222222222 | 0 |
| 0.8729166666666667 | 0 |
| 0.873611111111111 | 0 |
| 0.8743055555555556 | 0 |
| 0.875 | 0 |
| 0.8756944444444444 | 0 |
| 0.876388888888889 | 0 |
| 0.8770833333333333 | 0 |
| 0.8777777777777778 | 0 |
| 0.8784722222222222 | 0 |
| 0.8791666666666668 | 0 |
| 0.8798611111111111 | 0 |
| 0.8805555555555555 | 0 |
| 0.88125 | 0 |
| 0.8819444444444445 | 0 |
| 0.8826388888888889 | 0 |
| 0.8833333333333333 | 0 |
| 0.8840277777777777 | 0 |
| 0.8847222222222223 | 0 |
| 0.8854166666666666 | 0 |
| 0.8861111111111111 | 0 |
| 0.8868055555555556 | 0 |
| 0.8875000000000001 | 0 |
| 0.8881944444444444 | 0 |
| 0.8888888888888888 | 0 |
| 0.8895833333333334 | 0 |
| 0.8902777777777778 | 0 |
| 0.8909722222222222 | 0 |
| 0.8916666666666666 | 0 |
| 0.8923611111111112 | 0 |
| 0.8930555555555556 | 0 |
| 0.8937499999999999 | 0 |
| 0.8944444444444444 | 0 |
| 0.8951388888888889 | 0 |
| 0.8958333333333334 | 0 |
| 0.8965277777777777 | 0 |
| 0.8972222222222223 | 0 |
| 0.8979166666666667 | 0 |
| 0.8986111111111111 | 0 |
| 0.8993055555555555 | 0 |
| 0.9 | 0 |
| 0.9006944444444445 | 0 |
| 0.9013888888888889 | 0 |
| 0.9020833333333332 | 0 |
| 0.9027777777777778 | 0 |
| 0.9034722222222222 | 0 |
| 0.9041666666666667 | 0 |
| 0.904861111111111 | 0 |
| 0.9055555555555556 | 0 |
| 0.90625 | 0 |
| 0.9069444444444444 | 0 |
| 0.907638888888889 | 0 |
| 0.9083333333333333 | 0 |
| 0.9090277777777778 | 0 |
| 0.9097222222222222 | 0 |
| 0.9104166666666668 | 0 |
| 0.9111111111111111 | 0 |
| 0.9118055555555555 | 0 |
| 0.9125 | 0 |
| 0.9131944444444445 | 0 |
| 0.9138888888888889 | 0 |
| 0.9145833333333333 | 0 |
| 0.9152777777777777 | 0 |
| 0.9159722222222223 | 0 |
| 0.9166666666666666 | 0 |
| 0.9173611111111111 | 0 |
| 0.9180555555555556 | 0 |
| 0.9187500000000001 | 0 |
| 0.9194444444444444 | 0 |
| 0.9201388888888888 | 0 |
| 0.9208333333333334 | 0 |
| 0.9215277777777778 | 0 |
| 0.9222222222222222 | 0 |
| 0.9229166666666666 | 0 |
| 0.9236111111111112 | 0 |
| 0.9243055555555556 | 0 |
| 0.9249999999999999 | 0 |
| 0.9256944444444444 | 0 |
| 0.9263888888888889 | 0 |
| 0.9270833333333334 | 0 |
| 0.9277777777777777 | 0 |
| 0.9284722222222223 | 0 |
| 0.9291666666666667 | 0 |
| 0.9298611111111111 | 0 |
| 0.9305555555555555 | 0 |
| 0.93125 | 0 |
| 0.9319444444444445 | 0 |
| 0.9326388888888889 | 0 |
| 0.9333333333333332 | 0 |
| 0.9340277777777778 | 0 |
| 0.9347222222222222 | 0 |
| 0.9354166666666667 | 0 |
| 0.936111111111111 | 0 |
| 0.9368055555555556 | 0 |
| 0.9375 | 0 |
| 0.9381944444444444 | 0 |
| 0.938888888888889 | 0 |
| 0.9395833333333333 | 0 |
| 0.9402777777777778 | 0 |
| 0.9409722222222222 | 0 |
| 0.9416666666666668 | 0 |
| 0.9423611111111111 | 0 |
| 0.9430555555555555 | 0 |
| 0.94375 | 0 |
| 0.9444444444444445 | 0 |
| 0.9451388888888889 | 0 |
| 0.9458333333333333 | 0 |
| 0.9465277777777777 | 0 |
| 0.9472222222222223 | 0 |
| 0.9479166666666666 | 0 |
| 0.9486111111111111 | 0 |
| 0.9493055555555556 | 0 |
| 0.9500000000000001 | 0 |
| 0.9506944444444444 | 0 |
| 0.9513888888888888 | 0 |
| 0.9520833333333334 | 0 |
| 0.9527777777777778 | 0 |
| 0.9534722222222222 | 0 |
| 0.9541666666666666 | 0 |
| 0.9548611111111112 | 0 |
| 0.9555555555555556 | 0 |
| 0.9562499999999999 | 0 |
| 0.9569444444444444 | 0 |
| 0.9576388888888889 | 0 |
| 0.9583333333333334 | 0 |
| 0.9590277777777777 | 0 |
| 0.9597222222222223 | 0 |
| 0.9604166666666667 | 0 |
| 0.9611111111111111 | 0 |
| 0.9618055555555555 | 0 |
| 0.9625 | 0 |
| 0.9631944444444445 | 0 |
| 0.9638888888888889 | 0 |
| 0.9645833333333332 | 0 |
| 0.9652777777777778 | 0 |
| 0.9659722222222222 | 0 |
| 0.9666666666666667 | 0 |
| 0.967361111111111 | 0 |
| 0.9680555555555556 | 0 |
| 0.96875 | 0 |
| 0.9694444444444444 | 0 |
| 0.970138888888889 | 0 |
| 0.9708333333333333 | 0 |
| 0.9715277777777778 | 0 |
| 0.9722222222222222 | 0 |
| 0.9729166666666668 | 0 |
| 0.9736111111111111 | 0 |
| 0.9743055555555555 | 0 |
| 0.975 | 0 |
| 0.9756944444444445 | 0 |
| 0.9763888888888889 | 0 |
| 0.9770833333333333 | 0 |
| 0.9777777777777777 | 0 |
| 0.9784722222222223 | 0 |
| 0.9791666666666666 | 0 |
| 0.9798611111111111 | 0 |
| 0.9805555555555556 | 0 |
| 0.9812500000000001 | 0 |
| 0.9819444444444444 | 0 |
| 0.9826388888888888 | 0 |
| 0.9833333333333334 | 0 |
| 0.9840277777777778 | 0 |
| 0.9847222222222222 | 0 |
| 0.9854166666666666 | 0 |
| 0.9861111111111112 | 0 |
| 0.9868055555555556 | 0 |
| 0.9874999999999999 | 0 |
| 0.9881944444444444 | 0 |
| 0.9888888888888889 | 0 |
| 0.9895833333333334 | 0 |
| 0.9902777777777777 | 0 |
| 0.9909722222222223 | 0 |
| 0.9916666666666667 | 0 |
| 0.9923611111111111 | 0 |
| 0.9930555555555555 | 0 |
| 0.99375 | 0 |
| 0.9944444444444445 | 0 |
| 0.9951388888888889 | 0 |
| 0.9958333333333332 | 0 |
| 0.9965277777777778 | 0 |
| 0.9972222222222222 | 0 |
| 0.9979166666666667 | 0 |
| 0.998611111111111 | 0 |
| 0.9993055555555556 | 0 |